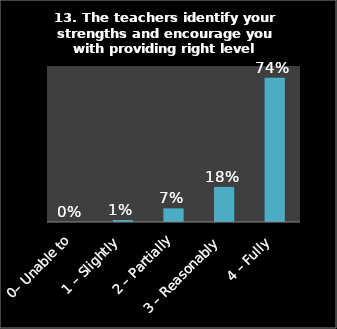
| Category | Series 0 |
|---|---|
| 0– Unable to | 0 |
| 1 – Slightly | 0.01 |
| 2 – Partially | 0.07 |
| 3 – Reasonably | 0.18 |
| 4 – Fully | 0.74 |